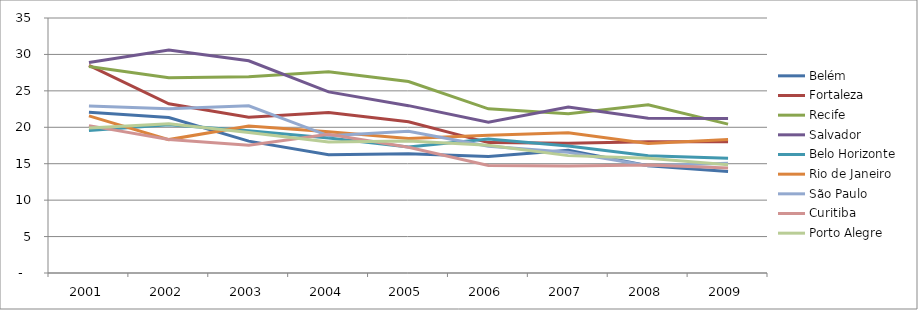
| Category | Belém | Fortaleza | Recife | Salvador | Belo Horizonte | Rio de Janeiro | São Paulo | Curitiba | Porto Alegre |
|---|---|---|---|---|---|---|---|---|---|
| 2001.0 | 22.05 | 28.49 | 28.35 | 28.89 | 19.56 | 21.57 | 22.92 | 20.23 | 19.91 |
| 2002.0 | 21.33 | 23.22 | 26.81 | 30.62 | 20.35 | 18.31 | 22.53 | 18.31 | 20.49 |
| 2003.0 | 18.1 | 21.39 | 26.92 | 29.13 | 19.54 | 20.19 | 22.94 | 17.53 | 19.27 |
| 2004.0 | 16.24 | 22.03 | 27.61 | 24.86 | 18.52 | 19.39 | 18.83 | 19.05 | 17.97 |
| 2005.0 | 16.37 | 20.75 | 26.28 | 22.97 | 17.31 | 18.47 | 19.46 | 17.25 | 18.13 |
| 2006.0 | 15.98 | 17.9 | 22.53 | 20.68 | 18.39 | 18.91 | 17.4 | 14.77 | 17.54 |
| 2007.0 | 16.85 | 17.82 | 21.86 | 22.77 | 17.44 | 19.24 | 16.57 | 14.68 | 16.11 |
| 2008.0 | 14.71 | 18 | 23.1 | 21.25 | 16.09 | 17.78 | 14.71 | 14.82 | 15.76 |
| 2009.0 | 13.93 | 18.02 | 20.43 | 21.22 | 15.74 | 18.31 | 15.08 | 14.42 | 14.85 |